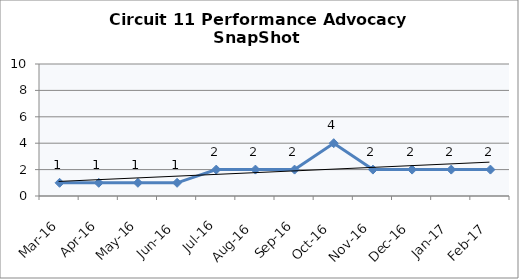
| Category | Circuit 11 |
|---|---|
| Mar-16 | 1 |
| Apr-16 | 1 |
| May-16 | 1 |
| Jun-16 | 1 |
| Jul-16 | 2 |
| Aug-16 | 2 |
| Sep-16 | 2 |
| Oct-16 | 4 |
| Nov-16 | 2 |
| Dec-16 | 2 |
| Jan-17 | 2 |
| Feb-17 | 2 |